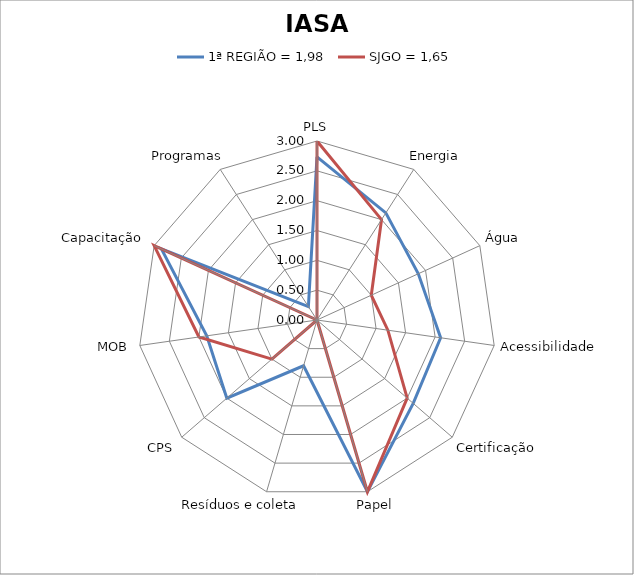
| Category | 1ª REGIÃO = 1,98 | SJGO = 1,65 |
|---|---|---|
| PLS | 2.733 | 3 |
| Energia | 2.133 | 2 |
| Água | 1.867 | 1 |
| Acessibilidade | 2.093 | 1.2 |
| Certificação | 2.133 | 2 |
| Papel | 3 | 3 |
| Resíduos e coleta | 0.8 | 0 |
| CPS | 2 | 1 |
| MOB | 1.867 | 2 |
| Capacitação | 2.867 | 3 |
| Programas | 0.267 | 0 |